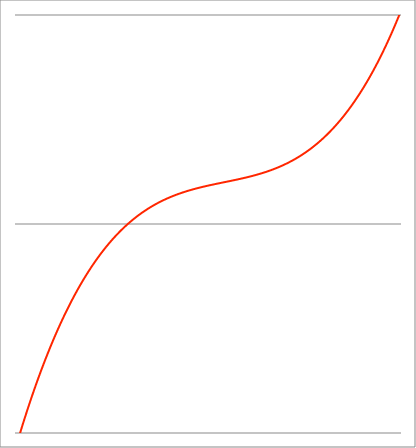
| Category | Series 1 |
|---|---|
| -1.02 | -1.065 |
| -1.019055 | -1.062 |
| -1.01811 | -1.059 |
| -1.017165 | -1.056 |
| -1.01622 | -1.053 |
| -1.015275 | -1.05 |
| -1.01433 | -1.046 |
| -1.013385 | -1.043 |
| -1.01244 | -1.04 |
| -1.011495 | -1.037 |
| -1.01055 | -1.034 |
| -1.009605 | -1.031 |
| -1.00866 | -1.028 |
| -1.007715 | -1.025 |
| -1.00677 | -1.022 |
| -1.005825 | -1.019 |
| -1.00488 | -1.016 |
| -1.003935 | -1.013 |
| -1.00299 | -1.01 |
| -1.002045000000001 | -1.007 |
| -1.001100000000001 | -1.004 |
| -1.000155000000001 | -1 |
| -0.999210000000001 | -0.997 |
| -0.998265000000001 | -0.994 |
| -0.997320000000001 | -0.991 |
| -0.996375000000001 | -0.988 |
| -0.995430000000001 | -0.985 |
| -0.994485000000001 | -0.982 |
| -0.993540000000001 | -0.979 |
| -0.992595000000001 | -0.976 |
| -0.991650000000001 | -0.973 |
| -0.990705000000001 | -0.971 |
| -0.989760000000001 | -0.968 |
| -0.988815000000001 | -0.965 |
| -0.987870000000001 | -0.962 |
| -0.986925000000001 | -0.959 |
| -0.985980000000001 | -0.956 |
| -0.985035000000001 | -0.953 |
| -0.984090000000001 | -0.95 |
| -0.983145000000001 | -0.947 |
| -0.982200000000001 | -0.944 |
| -0.981255000000001 | -0.941 |
| -0.980310000000001 | -0.938 |
| -0.979365000000001 | -0.935 |
| -0.978420000000001 | -0.932 |
| -0.977475000000001 | -0.929 |
| -0.976530000000001 | -0.927 |
| -0.975585000000001 | -0.924 |
| -0.974640000000001 | -0.921 |
| -0.973695000000001 | -0.918 |
| -0.972750000000001 | -0.915 |
| -0.971805000000001 | -0.912 |
| -0.970860000000001 | -0.909 |
| -0.969915000000001 | -0.906 |
| -0.968970000000001 | -0.904 |
| -0.968025000000001 | -0.901 |
| -0.967080000000001 | -0.898 |
| -0.966135000000001 | -0.895 |
| -0.965190000000002 | -0.892 |
| -0.964245000000002 | -0.889 |
| -0.963300000000002 | -0.887 |
| -0.962355000000002 | -0.884 |
| -0.961410000000002 | -0.881 |
| -0.960465000000002 | -0.878 |
| -0.959520000000002 | -0.875 |
| -0.958575000000002 | -0.873 |
| -0.957630000000002 | -0.87 |
| -0.956685000000002 | -0.867 |
| -0.955740000000002 | -0.864 |
| -0.954795000000002 | -0.861 |
| -0.953850000000002 | -0.859 |
| -0.952905000000002 | -0.856 |
| -0.951960000000002 | -0.853 |
| -0.951015000000002 | -0.85 |
| -0.950070000000002 | -0.848 |
| -0.949125000000002 | -0.845 |
| -0.948180000000002 | -0.842 |
| -0.947235000000002 | -0.839 |
| -0.946290000000002 | -0.837 |
| -0.945345000000002 | -0.834 |
| -0.944400000000002 | -0.831 |
| -0.943455000000002 | -0.828 |
| -0.942510000000002 | -0.826 |
| -0.941565000000002 | -0.823 |
| -0.940620000000002 | -0.82 |
| -0.939675000000002 | -0.818 |
| -0.938730000000002 | -0.815 |
| -0.937785000000002 | -0.812 |
| -0.936840000000002 | -0.81 |
| -0.935895000000002 | -0.807 |
| -0.934950000000002 | -0.804 |
| -0.934005000000002 | -0.802 |
| -0.933060000000002 | -0.799 |
| -0.932115000000002 | -0.796 |
| -0.931170000000002 | -0.794 |
| -0.930225000000002 | -0.791 |
| -0.929280000000003 | -0.788 |
| -0.928335000000003 | -0.786 |
| -0.927390000000003 | -0.783 |
| -0.926445000000003 | -0.78 |
| -0.925500000000003 | -0.778 |
| -0.924555000000003 | -0.775 |
| -0.923610000000003 | -0.773 |
| -0.922665000000003 | -0.77 |
| -0.921720000000003 | -0.767 |
| -0.920775000000003 | -0.765 |
| -0.919830000000003 | -0.762 |
| -0.918885000000003 | -0.76 |
| -0.917940000000003 | -0.757 |
| -0.916995000000003 | -0.754 |
| -0.916050000000003 | -0.752 |
| -0.915105000000003 | -0.749 |
| -0.914160000000003 | -0.747 |
| -0.913215000000003 | -0.744 |
| -0.912270000000003 | -0.742 |
| -0.911325000000003 | -0.739 |
| -0.910380000000003 | -0.737 |
| -0.909435000000003 | -0.734 |
| -0.908490000000003 | -0.732 |
| -0.907545000000003 | -0.729 |
| -0.906600000000003 | -0.726 |
| -0.905655000000003 | -0.724 |
| -0.904710000000003 | -0.721 |
| -0.903765000000003 | -0.719 |
| -0.902820000000003 | -0.716 |
| -0.901875000000003 | -0.714 |
| -0.900930000000003 | -0.711 |
| -0.899985000000003 | -0.709 |
| -0.899040000000003 | -0.706 |
| -0.898095000000003 | -0.704 |
| -0.897150000000003 | -0.702 |
| -0.896205000000003 | -0.699 |
| -0.895260000000003 | -0.697 |
| -0.894315000000003 | -0.694 |
| -0.893370000000003 | -0.692 |
| -0.892425000000004 | -0.689 |
| -0.891480000000004 | -0.687 |
| -0.890535000000004 | -0.684 |
| -0.889590000000004 | -0.682 |
| -0.888645000000004 | -0.679 |
| -0.887700000000004 | -0.677 |
| -0.886755000000004 | -0.675 |
| -0.885810000000004 | -0.672 |
| -0.884865000000004 | -0.67 |
| -0.883920000000004 | -0.667 |
| -0.882975000000004 | -0.665 |
| -0.882030000000004 | -0.663 |
| -0.881085000000004 | -0.66 |
| -0.880140000000004 | -0.658 |
| -0.879195000000004 | -0.655 |
| -0.878250000000004 | -0.653 |
| -0.877305000000004 | -0.651 |
| -0.876360000000004 | -0.648 |
| -0.875415000000004 | -0.646 |
| -0.874470000000004 | -0.644 |
| -0.873525000000004 | -0.641 |
| -0.872580000000004 | -0.639 |
| -0.871635000000004 | -0.637 |
| -0.870690000000004 | -0.634 |
| -0.869745000000004 | -0.632 |
| -0.868800000000004 | -0.63 |
| -0.867855000000004 | -0.627 |
| -0.866910000000004 | -0.625 |
| -0.865965000000004 | -0.623 |
| -0.865020000000004 | -0.62 |
| -0.864075000000004 | -0.618 |
| -0.863130000000004 | -0.616 |
| -0.862185000000004 | -0.613 |
| -0.861240000000004 | -0.611 |
| -0.860295000000004 | -0.609 |
| -0.859350000000004 | -0.606 |
| -0.858405000000004 | -0.604 |
| -0.857460000000004 | -0.602 |
| -0.856515000000005 | -0.6 |
| -0.855570000000005 | -0.597 |
| -0.854625000000005 | -0.595 |
| -0.853680000000005 | -0.593 |
| -0.852735000000005 | -0.591 |
| -0.851790000000005 | -0.588 |
| -0.850845000000005 | -0.586 |
| -0.849900000000005 | -0.584 |
| -0.848955000000005 | -0.582 |
| -0.848010000000005 | -0.579 |
| -0.847065000000005 | -0.577 |
| -0.846120000000005 | -0.575 |
| -0.845175000000005 | -0.573 |
| -0.844230000000005 | -0.571 |
| -0.843285000000005 | -0.568 |
| -0.842340000000005 | -0.566 |
| -0.841395000000005 | -0.564 |
| -0.840450000000005 | -0.562 |
| -0.839505000000005 | -0.56 |
| -0.838560000000005 | -0.557 |
| -0.837615000000005 | -0.555 |
| -0.836670000000005 | -0.553 |
| -0.835725000000005 | -0.551 |
| -0.834780000000005 | -0.549 |
| -0.833835000000005 | -0.547 |
| -0.832890000000005 | -0.544 |
| -0.831945000000005 | -0.542 |
| -0.831000000000005 | -0.54 |
| -0.830055000000005 | -0.538 |
| -0.829110000000005 | -0.536 |
| -0.828165000000005 | -0.534 |
| -0.827220000000005 | -0.532 |
| -0.826275000000005 | -0.529 |
| -0.825330000000005 | -0.527 |
| -0.824385000000005 | -0.525 |
| -0.823440000000005 | -0.523 |
| -0.822495000000005 | -0.521 |
| -0.821550000000006 | -0.519 |
| -0.820605000000006 | -0.517 |
| -0.819660000000006 | -0.515 |
| -0.818715000000006 | -0.513 |
| -0.817770000000006 | -0.51 |
| -0.816825000000006 | -0.508 |
| -0.815880000000006 | -0.506 |
| -0.814935000000006 | -0.504 |
| -0.813990000000006 | -0.502 |
| -0.813045000000006 | -0.5 |
| -0.812100000000006 | -0.498 |
| -0.811155000000006 | -0.496 |
| -0.810210000000006 | -0.494 |
| -0.809265000000006 | -0.492 |
| -0.808320000000006 | -0.49 |
| -0.807375000000006 | -0.488 |
| -0.806430000000006 | -0.486 |
| -0.805485000000006 | -0.484 |
| -0.804540000000006 | -0.482 |
| -0.803595000000006 | -0.48 |
| -0.802650000000006 | -0.478 |
| -0.801705000000006 | -0.476 |
| -0.800760000000006 | -0.474 |
| -0.799815000000006 | -0.472 |
| -0.798870000000006 | -0.47 |
| -0.797925000000006 | -0.468 |
| -0.796980000000006 | -0.466 |
| -0.796035000000006 | -0.464 |
| -0.795090000000006 | -0.462 |
| -0.794145000000006 | -0.46 |
| -0.793200000000006 | -0.458 |
| -0.792255000000006 | -0.456 |
| -0.791310000000006 | -0.454 |
| -0.790365000000006 | -0.452 |
| -0.789420000000006 | -0.45 |
| -0.788475000000006 | -0.448 |
| -0.787530000000006 | -0.446 |
| -0.786585000000006 | -0.444 |
| -0.785640000000006 | -0.442 |
| -0.784695000000006 | -0.44 |
| -0.783750000000007 | -0.438 |
| -0.782805000000007 | -0.436 |
| -0.781860000000007 | -0.434 |
| -0.780915000000007 | -0.432 |
| -0.779970000000007 | -0.43 |
| -0.779025000000007 | -0.429 |
| -0.778080000000007 | -0.427 |
| -0.777135000000007 | -0.425 |
| -0.776190000000007 | -0.423 |
| -0.775245000000007 | -0.421 |
| -0.774300000000007 | -0.419 |
| -0.773355000000007 | -0.417 |
| -0.772410000000007 | -0.415 |
| -0.771465000000007 | -0.413 |
| -0.770520000000007 | -0.412 |
| -0.769575000000007 | -0.41 |
| -0.768630000000007 | -0.408 |
| -0.767685000000007 | -0.406 |
| -0.766740000000007 | -0.404 |
| -0.765795000000007 | -0.402 |
| -0.764850000000007 | -0.4 |
| -0.763905000000007 | -0.399 |
| -0.762960000000007 | -0.397 |
| -0.762015000000007 | -0.395 |
| -0.761070000000007 | -0.393 |
| -0.760125000000007 | -0.391 |
| -0.759180000000007 | -0.389 |
| -0.758235000000007 | -0.388 |
| -0.757290000000007 | -0.386 |
| -0.756345000000007 | -0.384 |
| -0.755400000000007 | -0.382 |
| -0.754455000000007 | -0.38 |
| -0.753510000000007 | -0.379 |
| -0.752565000000007 | -0.377 |
| -0.751620000000007 | -0.375 |
| -0.750675000000007 | -0.373 |
| -0.749730000000007 | -0.371 |
| -0.748785000000008 | -0.37 |
| -0.747840000000008 | -0.368 |
| -0.746895000000008 | -0.366 |
| -0.745950000000008 | -0.364 |
| -0.745005000000008 | -0.363 |
| -0.744060000000008 | -0.361 |
| -0.743115000000008 | -0.359 |
| -0.742170000000008 | -0.357 |
| -0.741225000000008 | -0.355 |
| -0.740280000000008 | -0.354 |
| -0.739335000000008 | -0.352 |
| -0.738390000000008 | -0.35 |
| -0.737445000000008 | -0.349 |
| -0.736500000000008 | -0.347 |
| -0.735555000000008 | -0.345 |
| -0.734610000000008 | -0.343 |
| -0.733665000000008 | -0.342 |
| -0.732720000000008 | -0.34 |
| -0.731775000000008 | -0.338 |
| -0.730830000000008 | -0.337 |
| -0.729885000000008 | -0.335 |
| -0.728940000000008 | -0.333 |
| -0.727995000000008 | -0.331 |
| -0.727050000000008 | -0.33 |
| -0.726105000000008 | -0.328 |
| -0.725160000000008 | -0.326 |
| -0.724215000000008 | -0.325 |
| -0.723270000000008 | -0.323 |
| -0.722325000000008 | -0.321 |
| -0.721380000000008 | -0.32 |
| -0.720435000000008 | -0.318 |
| -0.719490000000008 | -0.316 |
| -0.718545000000008 | -0.315 |
| -0.717600000000008 | -0.313 |
| -0.716655000000008 | -0.311 |
| -0.715710000000008 | -0.31 |
| -0.714765000000008 | -0.308 |
| -0.713820000000008 | -0.306 |
| -0.712875000000009 | -0.305 |
| -0.711930000000009 | -0.303 |
| -0.710985000000009 | -0.302 |
| -0.710040000000009 | -0.3 |
| -0.709095000000009 | -0.298 |
| -0.708150000000009 | -0.297 |
| -0.707205000000009 | -0.295 |
| -0.706260000000009 | -0.294 |
| -0.705315000000009 | -0.292 |
| -0.704370000000009 | -0.29 |
| -0.703425000000009 | -0.289 |
| -0.702480000000009 | -0.287 |
| -0.701535000000009 | -0.286 |
| -0.700590000000009 | -0.284 |
| -0.699645000000009 | -0.282 |
| -0.698700000000009 | -0.281 |
| -0.697755000000009 | -0.279 |
| -0.696810000000009 | -0.278 |
| -0.695865000000009 | -0.276 |
| -0.694920000000009 | -0.275 |
| -0.693975000000009 | -0.273 |
| -0.693030000000009 | -0.271 |
| -0.692085000000009 | -0.27 |
| -0.691140000000009 | -0.268 |
| -0.690195000000009 | -0.267 |
| -0.689250000000009 | -0.265 |
| -0.688305000000009 | -0.264 |
| -0.687360000000009 | -0.262 |
| -0.686415000000009 | -0.261 |
| -0.685470000000009 | -0.259 |
| -0.684525000000009 | -0.258 |
| -0.683580000000009 | -0.256 |
| -0.682635000000009 | -0.255 |
| -0.681690000000009 | -0.253 |
| -0.680745000000009 | -0.252 |
| -0.679800000000009 | -0.25 |
| -0.678855000000009 | -0.249 |
| -0.677910000000009 | -0.247 |
| -0.676965000000009 | -0.246 |
| -0.67602000000001 | -0.244 |
| -0.67507500000001 | -0.243 |
| -0.67413000000001 | -0.241 |
| -0.67318500000001 | -0.24 |
| -0.67224000000001 | -0.238 |
| -0.67129500000001 | -0.237 |
| -0.67035000000001 | -0.235 |
| -0.66940500000001 | -0.234 |
| -0.66846000000001 | -0.232 |
| -0.66751500000001 | -0.231 |
| -0.66657000000001 | -0.229 |
| -0.66562500000001 | -0.228 |
| -0.66468000000001 | -0.227 |
| -0.66373500000001 | -0.225 |
| -0.66279000000001 | -0.224 |
| -0.66184500000001 | -0.222 |
| -0.66090000000001 | -0.221 |
| -0.65995500000001 | -0.219 |
| -0.65901000000001 | -0.218 |
| -0.65806500000001 | -0.217 |
| -0.65712000000001 | -0.215 |
| -0.65617500000001 | -0.214 |
| -0.65523000000001 | -0.212 |
| -0.65428500000001 | -0.211 |
| -0.65334000000001 | -0.21 |
| -0.65239500000001 | -0.208 |
| -0.65145000000001 | -0.207 |
| -0.65050500000001 | -0.205 |
| -0.64956000000001 | -0.204 |
| -0.64861500000001 | -0.203 |
| -0.64767000000001 | -0.201 |
| -0.64672500000001 | -0.2 |
| -0.64578000000001 | -0.198 |
| -0.64483500000001 | -0.197 |
| -0.64389000000001 | -0.196 |
| -0.64294500000001 | -0.194 |
| -0.64200000000001 | -0.193 |
| -0.64105500000001 | -0.192 |
| -0.640110000000011 | -0.19 |
| -0.639165000000011 | -0.189 |
| -0.638220000000011 | -0.188 |
| -0.637275000000011 | -0.186 |
| -0.636330000000011 | -0.185 |
| -0.635385000000011 | -0.184 |
| -0.634440000000011 | -0.182 |
| -0.633495000000011 | -0.181 |
| -0.632550000000011 | -0.18 |
| -0.631605000000011 | -0.178 |
| -0.630660000000011 | -0.177 |
| -0.629715000000011 | -0.176 |
| -0.628770000000011 | -0.174 |
| -0.627825000000011 | -0.173 |
| -0.626880000000011 | -0.172 |
| -0.625935000000011 | -0.17 |
| -0.624990000000011 | -0.169 |
| -0.624045000000011 | -0.168 |
| -0.623100000000011 | -0.167 |
| -0.622155000000011 | -0.165 |
| -0.621210000000011 | -0.164 |
| -0.620265000000011 | -0.163 |
| -0.619320000000011 | -0.161 |
| -0.618375000000011 | -0.16 |
| -0.617430000000011 | -0.159 |
| -0.616485000000011 | -0.158 |
| -0.615540000000011 | -0.156 |
| -0.614595000000011 | -0.155 |
| -0.613650000000011 | -0.154 |
| -0.612705000000011 | -0.153 |
| -0.611760000000011 | -0.151 |
| -0.610815000000011 | -0.15 |
| -0.609870000000011 | -0.149 |
| -0.608925000000011 | -0.148 |
| -0.607980000000011 | -0.146 |
| -0.607035000000011 | -0.145 |
| -0.606090000000011 | -0.144 |
| -0.605145000000012 | -0.143 |
| -0.604200000000012 | -0.141 |
| -0.603255000000012 | -0.14 |
| -0.602310000000012 | -0.139 |
| -0.601365000000012 | -0.138 |
| -0.600420000000012 | -0.137 |
| -0.599475000000012 | -0.135 |
| -0.598530000000012 | -0.134 |
| -0.597585000000012 | -0.133 |
| -0.596640000000012 | -0.132 |
| -0.595695000000012 | -0.131 |
| -0.594750000000012 | -0.129 |
| -0.593805000000012 | -0.128 |
| -0.592860000000012 | -0.127 |
| -0.591915000000012 | -0.126 |
| -0.590970000000012 | -0.125 |
| -0.590025000000012 | -0.123 |
| -0.589080000000012 | -0.122 |
| -0.588135000000012 | -0.121 |
| -0.587190000000012 | -0.12 |
| -0.586245000000012 | -0.119 |
| -0.585300000000012 | -0.118 |
| -0.584355000000012 | -0.116 |
| -0.583410000000012 | -0.115 |
| -0.582465000000012 | -0.114 |
| -0.581520000000012 | -0.113 |
| -0.580575000000012 | -0.112 |
| -0.579630000000012 | -0.111 |
| -0.578685000000012 | -0.11 |
| -0.577740000000012 | -0.108 |
| -0.576795000000012 | -0.107 |
| -0.575850000000012 | -0.106 |
| -0.574905000000012 | -0.105 |
| -0.573960000000012 | -0.104 |
| -0.573015000000012 | -0.103 |
| -0.572070000000013 | -0.102 |
| -0.571125000000013 | -0.101 |
| -0.570180000000013 | -0.099 |
| -0.569235000000013 | -0.098 |
| -0.568290000000013 | -0.097 |
| -0.567345000000013 | -0.096 |
| -0.566400000000013 | -0.095 |
| -0.565455000000013 | -0.094 |
| -0.564510000000013 | -0.093 |
| -0.563565000000013 | -0.092 |
| -0.562620000000013 | -0.091 |
| -0.561675000000013 | -0.09 |
| -0.560730000000013 | -0.088 |
| -0.559785000000013 | -0.087 |
| -0.558840000000013 | -0.086 |
| -0.557895000000013 | -0.085 |
| -0.556950000000013 | -0.084 |
| -0.556005000000013 | -0.083 |
| -0.555060000000013 | -0.082 |
| -0.554115000000013 | -0.081 |
| -0.553170000000013 | -0.08 |
| -0.552225000000013 | -0.079 |
| -0.551280000000013 | -0.078 |
| -0.550335000000013 | -0.077 |
| -0.549390000000013 | -0.076 |
| -0.548445000000013 | -0.075 |
| -0.547500000000013 | -0.074 |
| -0.546555000000013 | -0.073 |
| -0.545610000000013 | -0.072 |
| -0.544665000000013 | -0.071 |
| -0.543720000000013 | -0.069 |
| -0.542775000000013 | -0.068 |
| -0.541830000000013 | -0.067 |
| -0.540885000000013 | -0.066 |
| -0.539940000000013 | -0.065 |
| -0.538995000000013 | -0.064 |
| -0.538050000000013 | -0.063 |
| -0.537105000000013 | -0.062 |
| -0.536160000000014 | -0.061 |
| -0.535215000000014 | -0.06 |
| -0.534270000000014 | -0.059 |
| -0.533325000000014 | -0.058 |
| -0.532380000000014 | -0.057 |
| -0.531435000000014 | -0.056 |
| -0.530490000000014 | -0.055 |
| -0.529545000000014 | -0.054 |
| -0.528600000000014 | -0.053 |
| -0.527655000000014 | -0.052 |
| -0.526710000000014 | -0.051 |
| -0.525765000000014 | -0.05 |
| -0.524820000000014 | -0.05 |
| -0.523875000000014 | -0.049 |
| -0.522930000000014 | -0.048 |
| -0.521985000000014 | -0.047 |
| -0.521040000000014 | -0.046 |
| -0.520095000000014 | -0.045 |
| -0.519150000000014 | -0.044 |
| -0.518205000000014 | -0.043 |
| -0.517260000000014 | -0.042 |
| -0.516315000000014 | -0.041 |
| -0.515370000000014 | -0.04 |
| -0.514425000000014 | -0.039 |
| -0.513480000000014 | -0.038 |
| -0.512535000000014 | -0.037 |
| -0.511590000000014 | -0.036 |
| -0.510645000000014 | -0.035 |
| -0.509700000000014 | -0.034 |
| -0.508755000000014 | -0.033 |
| -0.507810000000014 | -0.033 |
| -0.506865000000014 | -0.032 |
| -0.505920000000014 | -0.031 |
| -0.504975000000014 | -0.03 |
| -0.504030000000014 | -0.029 |
| -0.503085000000014 | -0.028 |
| -0.502140000000014 | -0.027 |
| -0.501195000000014 | -0.026 |
| -0.500250000000015 | -0.025 |
| -0.499305000000014 | -0.024 |
| -0.498360000000015 | -0.023 |
| -0.497415000000015 | -0.023 |
| -0.496470000000015 | -0.022 |
| -0.495525000000015 | -0.021 |
| -0.494580000000015 | -0.02 |
| -0.493635000000015 | -0.019 |
| -0.492690000000015 | -0.018 |
| -0.491745000000015 | -0.017 |
| -0.490800000000015 | -0.016 |
| -0.489855000000015 | -0.016 |
| -0.488910000000015 | -0.015 |
| -0.487965000000015 | -0.014 |
| -0.487020000000015 | -0.013 |
| -0.486075000000015 | -0.012 |
| -0.485130000000015 | -0.011 |
| -0.484185000000015 | -0.01 |
| -0.483240000000015 | -0.009 |
| -0.482295000000015 | -0.009 |
| -0.481350000000015 | -0.008 |
| -0.480405000000015 | -0.007 |
| -0.479460000000015 | -0.006 |
| -0.478515000000015 | -0.005 |
| -0.477570000000015 | -0.004 |
| -0.476625000000015 | -0.004 |
| -0.475680000000015 | -0.003 |
| -0.474735000000015 | -0.002 |
| -0.473790000000015 | -0.001 |
| -0.472845000000015 | 0 |
| -0.471900000000015 | 0.001 |
| -0.470955000000015 | 0.001 |
| -0.470010000000015 | 0.002 |
| -0.469065000000015 | 0.003 |
| -0.468120000000015 | 0.004 |
| -0.467175000000015 | 0.005 |
| -0.466230000000015 | 0.005 |
| -0.465285000000015 | 0.006 |
| -0.464340000000015 | 0.007 |
| -0.463395000000016 | 0.008 |
| -0.462450000000016 | 0.009 |
| -0.461505000000016 | 0.009 |
| -0.460560000000016 | 0.01 |
| -0.459615000000016 | 0.011 |
| -0.458670000000016 | 0.012 |
| -0.457725000000016 | 0.013 |
| -0.456780000000016 | 0.013 |
| -0.455835000000016 | 0.014 |
| -0.454890000000016 | 0.015 |
| -0.453945000000016 | 0.016 |
| -0.453000000000016 | 0.016 |
| -0.452055000000016 | 0.017 |
| -0.451110000000016 | 0.018 |
| -0.450165000000016 | 0.019 |
| -0.449220000000016 | 0.02 |
| -0.448275000000016 | 0.02 |
| -0.447330000000016 | 0.021 |
| -0.446385000000016 | 0.022 |
| -0.445440000000016 | 0.023 |
| -0.444495000000016 | 0.023 |
| -0.443550000000016 | 0.024 |
| -0.442605000000016 | 0.025 |
| -0.441660000000016 | 0.026 |
| -0.440715000000016 | 0.026 |
| -0.439770000000016 | 0.027 |
| -0.438825000000016 | 0.028 |
| -0.437880000000016 | 0.028 |
| -0.436935000000016 | 0.029 |
| -0.435990000000016 | 0.03 |
| -0.435045000000016 | 0.031 |
| -0.434100000000016 | 0.031 |
| -0.433155000000016 | 0.032 |
| -0.432210000000016 | 0.033 |
| -0.431265000000016 | 0.034 |
| -0.430320000000016 | 0.034 |
| -0.429375000000016 | 0.035 |
| -0.428430000000016 | 0.036 |
| -0.427485000000017 | 0.036 |
| -0.426540000000017 | 0.037 |
| -0.425595000000017 | 0.038 |
| -0.424650000000017 | 0.038 |
| -0.423705000000017 | 0.039 |
| -0.422760000000017 | 0.04 |
| -0.421815000000017 | 0.041 |
| -0.420870000000017 | 0.041 |
| -0.419925000000017 | 0.042 |
| -0.418980000000017 | 0.043 |
| -0.418035000000017 | 0.043 |
| -0.417090000000017 | 0.044 |
| -0.416145000000017 | 0.045 |
| -0.415200000000017 | 0.045 |
| -0.414255000000017 | 0.046 |
| -0.413310000000017 | 0.047 |
| -0.412365000000017 | 0.047 |
| -0.411420000000017 | 0.048 |
| -0.410475000000017 | 0.049 |
| -0.409530000000017 | 0.049 |
| -0.408585000000017 | 0.05 |
| -0.407640000000017 | 0.051 |
| -0.406695000000017 | 0.051 |
| -0.405750000000017 | 0.052 |
| -0.404805000000017 | 0.053 |
| -0.403860000000017 | 0.053 |
| -0.402915000000017 | 0.054 |
| -0.401970000000017 | 0.055 |
| -0.401025000000017 | 0.055 |
| -0.400080000000017 | 0.056 |
| -0.399135000000017 | 0.057 |
| -0.398190000000017 | 0.057 |
| -0.397245000000017 | 0.058 |
| -0.396300000000017 | 0.058 |
| -0.395355000000017 | 0.059 |
| -0.394410000000017 | 0.06 |
| -0.393465000000017 | 0.06 |
| -0.392520000000017 | 0.061 |
| -0.391575000000017 | 0.062 |
| -0.390630000000018 | 0.062 |
| -0.389685000000018 | 0.063 |
| -0.388740000000018 | 0.064 |
| -0.387795000000018 | 0.064 |
| -0.386850000000018 | 0.065 |
| -0.385905000000018 | 0.065 |
| -0.384960000000018 | 0.066 |
| -0.384015000000018 | 0.067 |
| -0.383070000000018 | 0.067 |
| -0.382125000000018 | 0.068 |
| -0.381180000000018 | 0.068 |
| -0.380235000000018 | 0.069 |
| -0.379290000000018 | 0.07 |
| -0.378345000000018 | 0.07 |
| -0.377400000000018 | 0.071 |
| -0.376455000000018 | 0.071 |
| -0.375510000000018 | 0.072 |
| -0.374565000000018 | 0.073 |
| -0.373620000000018 | 0.073 |
| -0.372675000000018 | 0.074 |
| -0.371730000000018 | 0.074 |
| -0.370785000000018 | 0.075 |
| -0.369840000000018 | 0.075 |
| -0.368895000000018 | 0.076 |
| -0.367950000000018 | 0.077 |
| -0.367005000000018 | 0.077 |
| -0.366060000000018 | 0.078 |
| -0.365115000000018 | 0.078 |
| -0.364170000000018 | 0.079 |
| -0.363225000000018 | 0.079 |
| -0.362280000000018 | 0.08 |
| -0.361335000000018 | 0.081 |
| -0.360390000000018 | 0.081 |
| -0.359445000000018 | 0.082 |
| -0.358500000000018 | 0.082 |
| -0.357555000000018 | 0.083 |
| -0.356610000000018 | 0.083 |
| -0.355665000000018 | 0.084 |
| -0.354720000000019 | 0.084 |
| -0.353775000000019 | 0.085 |
| -0.352830000000019 | 0.086 |
| -0.351885000000019 | 0.086 |
| -0.350940000000019 | 0.087 |
| -0.349995000000019 | 0.087 |
| -0.349050000000019 | 0.088 |
| -0.348105000000019 | 0.088 |
| -0.347160000000019 | 0.089 |
| -0.346215000000019 | 0.089 |
| -0.345270000000019 | 0.09 |
| -0.344325000000019 | 0.09 |
| -0.343380000000019 | 0.091 |
| -0.342435000000019 | 0.091 |
| -0.341490000000019 | 0.092 |
| -0.340545000000019 | 0.092 |
| -0.339600000000019 | 0.093 |
| -0.338655000000019 | 0.093 |
| -0.337710000000019 | 0.094 |
| -0.336765000000019 | 0.094 |
| -0.335820000000019 | 0.095 |
| -0.334875000000019 | 0.095 |
| -0.333930000000019 | 0.096 |
| -0.332985000000019 | 0.096 |
| -0.332040000000019 | 0.097 |
| -0.331095000000019 | 0.097 |
| -0.330150000000019 | 0.098 |
| -0.329205000000019 | 0.098 |
| -0.328260000000019 | 0.099 |
| -0.327315000000019 | 0.099 |
| -0.326370000000019 | 0.1 |
| -0.325425000000019 | 0.1 |
| -0.324480000000019 | 0.101 |
| -0.323535000000019 | 0.101 |
| -0.322590000000019 | 0.102 |
| -0.321645000000019 | 0.102 |
| -0.320700000000019 | 0.103 |
| -0.31975500000002 | 0.103 |
| -0.31881000000002 | 0.104 |
| -0.31786500000002 | 0.104 |
| -0.31692000000002 | 0.105 |
| -0.31597500000002 | 0.105 |
| -0.31503000000002 | 0.106 |
| -0.31408500000002 | 0.106 |
| -0.31314000000002 | 0.107 |
| -0.31219500000002 | 0.107 |
| -0.31125000000002 | 0.108 |
| -0.31030500000002 | 0.108 |
| -0.30936000000002 | 0.109 |
| -0.30841500000002 | 0.109 |
| -0.30747000000002 | 0.109 |
| -0.30652500000002 | 0.11 |
| -0.30558000000002 | 0.11 |
| -0.30463500000002 | 0.111 |
| -0.30369000000002 | 0.111 |
| -0.30274500000002 | 0.112 |
| -0.30180000000002 | 0.112 |
| -0.30085500000002 | 0.113 |
| -0.29991000000002 | 0.113 |
| -0.29896500000002 | 0.113 |
| -0.29802000000002 | 0.114 |
| -0.29707500000002 | 0.114 |
| -0.29613000000002 | 0.115 |
| -0.29518500000002 | 0.115 |
| -0.29424000000002 | 0.116 |
| -0.29329500000002 | 0.116 |
| -0.29235000000002 | 0.117 |
| -0.29140500000002 | 0.117 |
| -0.29046000000002 | 0.117 |
| -0.28951500000002 | 0.118 |
| -0.28857000000002 | 0.118 |
| -0.28762500000002 | 0.119 |
| -0.28668000000002 | 0.119 |
| -0.28573500000002 | 0.12 |
| -0.28479000000002 | 0.12 |
| -0.283845000000021 | 0.12 |
| -0.282900000000021 | 0.121 |
| -0.281955000000021 | 0.121 |
| -0.281010000000021 | 0.122 |
| -0.280065000000021 | 0.122 |
| -0.279120000000021 | 0.122 |
| -0.278175000000021 | 0.123 |
| -0.277230000000021 | 0.123 |
| -0.276285000000021 | 0.124 |
| -0.275340000000021 | 0.124 |
| -0.274395000000021 | 0.124 |
| -0.273450000000021 | 0.125 |
| -0.272505000000021 | 0.125 |
| -0.271560000000021 | 0.126 |
| -0.270615000000021 | 0.126 |
| -0.269670000000021 | 0.126 |
| -0.268725000000021 | 0.127 |
| -0.267780000000021 | 0.127 |
| -0.266835000000021 | 0.128 |
| -0.265890000000021 | 0.128 |
| -0.264945000000021 | 0.128 |
| -0.264000000000021 | 0.129 |
| -0.263055000000021 | 0.129 |
| -0.262110000000021 | 0.13 |
| -0.261165000000021 | 0.13 |
| -0.260220000000021 | 0.13 |
| -0.259275000000021 | 0.131 |
| -0.258330000000021 | 0.131 |
| -0.257385000000021 | 0.131 |
| -0.256440000000021 | 0.132 |
| -0.255495000000021 | 0.132 |
| -0.254550000000021 | 0.133 |
| -0.253605000000021 | 0.133 |
| -0.252660000000021 | 0.133 |
| -0.251715000000021 | 0.134 |
| -0.250770000000021 | 0.134 |
| -0.249825000000021 | 0.134 |
| -0.248880000000021 | 0.135 |
| -0.247935000000021 | 0.135 |
| -0.246990000000021 | 0.136 |
| -0.246045000000021 | 0.136 |
| -0.245100000000021 | 0.136 |
| -0.244155000000021 | 0.137 |
| -0.243210000000021 | 0.137 |
| -0.242265000000021 | 0.137 |
| -0.241320000000021 | 0.138 |
| -0.240375000000021 | 0.138 |
| -0.239430000000021 | 0.138 |
| -0.238485000000021 | 0.139 |
| -0.237540000000021 | 0.139 |
| -0.236595000000021 | 0.139 |
| -0.235650000000021 | 0.14 |
| -0.234705000000021 | 0.14 |
| -0.233760000000021 | 0.14 |
| -0.232815000000021 | 0.141 |
| -0.231870000000021 | 0.141 |
| -0.230925000000021 | 0.142 |
| -0.229980000000021 | 0.142 |
| -0.229035000000021 | 0.142 |
| -0.228090000000021 | 0.143 |
| -0.227145000000021 | 0.143 |
| -0.226200000000021 | 0.143 |
| -0.225255000000021 | 0.144 |
| -0.224310000000021 | 0.144 |
| -0.223365000000021 | 0.144 |
| -0.222420000000021 | 0.145 |
| -0.221475000000021 | 0.145 |
| -0.220530000000021 | 0.145 |
| -0.219585000000021 | 0.145 |
| -0.218640000000021 | 0.146 |
| -0.217695000000021 | 0.146 |
| -0.216750000000021 | 0.146 |
| -0.215805000000021 | 0.147 |
| -0.214860000000021 | 0.147 |
| -0.213915000000021 | 0.147 |
| -0.212970000000021 | 0.148 |
| -0.212025000000021 | 0.148 |
| -0.211080000000021 | 0.148 |
| -0.210135000000021 | 0.149 |
| -0.209190000000021 | 0.149 |
| -0.208245000000021 | 0.149 |
| -0.207300000000021 | 0.15 |
| -0.206355000000021 | 0.15 |
| -0.205410000000021 | 0.15 |
| -0.204465000000021 | 0.151 |
| -0.203520000000021 | 0.151 |
| -0.202575000000021 | 0.151 |
| -0.201630000000021 | 0.151 |
| -0.200685000000021 | 0.152 |
| -0.199740000000021 | 0.152 |
| -0.198795000000021 | 0.152 |
| -0.197850000000021 | 0.153 |
| -0.196905000000021 | 0.153 |
| -0.195960000000021 | 0.153 |
| -0.195015000000021 | 0.154 |
| -0.194070000000021 | 0.154 |
| -0.193125000000021 | 0.154 |
| -0.192180000000021 | 0.154 |
| -0.191235000000021 | 0.155 |
| -0.190290000000021 | 0.155 |
| -0.189345000000021 | 0.155 |
| -0.188400000000021 | 0.156 |
| -0.187455000000021 | 0.156 |
| -0.186510000000021 | 0.156 |
| -0.185565000000021 | 0.156 |
| -0.184620000000021 | 0.157 |
| -0.183675000000021 | 0.157 |
| -0.182730000000021 | 0.157 |
| -0.181785000000021 | 0.158 |
| -0.180840000000021 | 0.158 |
| -0.179895000000021 | 0.158 |
| -0.178950000000021 | 0.158 |
| -0.178005000000021 | 0.159 |
| -0.177060000000021 | 0.159 |
| -0.176115000000021 | 0.159 |
| -0.175170000000021 | 0.16 |
| -0.174225000000021 | 0.16 |
| -0.173280000000021 | 0.16 |
| -0.172335000000021 | 0.16 |
| -0.171390000000021 | 0.161 |
| -0.170445000000021 | 0.161 |
| -0.169500000000021 | 0.161 |
| -0.168555000000021 | 0.162 |
| -0.167610000000021 | 0.162 |
| -0.166665000000021 | 0.162 |
| -0.165720000000021 | 0.162 |
| -0.164775000000021 | 0.163 |
| -0.163830000000021 | 0.163 |
| -0.162885000000021 | 0.163 |
| -0.161940000000021 | 0.163 |
| -0.160995000000021 | 0.164 |
| -0.160050000000021 | 0.164 |
| -0.159105000000021 | 0.164 |
| -0.158160000000021 | 0.164 |
| -0.157215000000021 | 0.165 |
| -0.156270000000021 | 0.165 |
| -0.155325000000021 | 0.165 |
| -0.154380000000021 | 0.165 |
| -0.153435000000021 | 0.166 |
| -0.152490000000021 | 0.166 |
| -0.151545000000021 | 0.166 |
| -0.150600000000021 | 0.166 |
| -0.149655000000021 | 0.167 |
| -0.148710000000021 | 0.167 |
| -0.147765000000021 | 0.167 |
| -0.146820000000021 | 0.167 |
| -0.145875000000021 | 0.168 |
| -0.144930000000021 | 0.168 |
| -0.143985000000021 | 0.168 |
| -0.143040000000021 | 0.168 |
| -0.142095000000021 | 0.169 |
| -0.141150000000021 | 0.169 |
| -0.140205000000021 | 0.169 |
| -0.139260000000021 | 0.169 |
| -0.138315000000021 | 0.17 |
| -0.137370000000021 | 0.17 |
| -0.136425000000021 | 0.17 |
| -0.135480000000021 | 0.17 |
| -0.134535000000021 | 0.171 |
| -0.133590000000021 | 0.171 |
| -0.132645000000021 | 0.171 |
| -0.131700000000021 | 0.171 |
| -0.130755000000021 | 0.172 |
| -0.129810000000021 | 0.172 |
| -0.128865000000021 | 0.172 |
| -0.127920000000021 | 0.172 |
| -0.126975000000021 | 0.173 |
| -0.126030000000021 | 0.173 |
| -0.125085000000021 | 0.173 |
| -0.124140000000021 | 0.173 |
| -0.123195000000021 | 0.173 |
| -0.122250000000021 | 0.174 |
| -0.121305000000021 | 0.174 |
| -0.120360000000021 | 0.174 |
| -0.119415000000021 | 0.174 |
| -0.118470000000021 | 0.175 |
| -0.117525000000021 | 0.175 |
| -0.116580000000021 | 0.175 |
| -0.115635000000021 | 0.175 |
| -0.114690000000021 | 0.176 |
| -0.113745000000021 | 0.176 |
| -0.112800000000021 | 0.176 |
| -0.111855000000021 | 0.176 |
| -0.110910000000021 | 0.176 |
| -0.109965000000021 | 0.177 |
| -0.109020000000021 | 0.177 |
| -0.108075000000021 | 0.177 |
| -0.107130000000021 | 0.177 |
| -0.106185000000021 | 0.178 |
| -0.105240000000021 | 0.178 |
| -0.104295000000021 | 0.178 |
| -0.103350000000021 | 0.178 |
| -0.102405000000021 | 0.178 |
| -0.101460000000021 | 0.179 |
| -0.100515000000021 | 0.179 |
| -0.0995700000000212 | 0.179 |
| -0.0986250000000212 | 0.179 |
| -0.0976800000000212 | 0.18 |
| -0.0967350000000212 | 0.18 |
| -0.0957900000000212 | 0.18 |
| -0.0948450000000212 | 0.18 |
| -0.0939000000000212 | 0.18 |
| -0.0929550000000212 | 0.181 |
| -0.0920100000000212 | 0.181 |
| -0.0910650000000212 | 0.181 |
| -0.0901200000000212 | 0.181 |
| -0.0891750000000212 | 0.181 |
| -0.0882300000000212 | 0.182 |
| -0.0872850000000212 | 0.182 |
| -0.0863400000000212 | 0.182 |
| -0.0853950000000212 | 0.182 |
| -0.0844500000000212 | 0.183 |
| -0.0835050000000212 | 0.183 |
| -0.0825600000000212 | 0.183 |
| -0.0816150000000212 | 0.183 |
| -0.0806700000000212 | 0.183 |
| -0.0797250000000212 | 0.184 |
| -0.0787800000000212 | 0.184 |
| -0.0778350000000212 | 0.184 |
| -0.0768900000000212 | 0.184 |
| -0.0759450000000212 | 0.184 |
| -0.0750000000000212 | 0.185 |
| -0.0740550000000212 | 0.185 |
| -0.0731100000000212 | 0.185 |
| -0.0721650000000212 | 0.185 |
| -0.0712200000000212 | 0.185 |
| -0.0702750000000212 | 0.186 |
| -0.0693300000000212 | 0.186 |
| -0.0683850000000212 | 0.186 |
| -0.0674400000000212 | 0.186 |
| -0.0664950000000212 | 0.186 |
| -0.0655500000000212 | 0.187 |
| -0.0646050000000212 | 0.187 |
| -0.0636600000000212 | 0.187 |
| -0.0627150000000212 | 0.187 |
| -0.0617700000000212 | 0.187 |
| -0.0608250000000212 | 0.188 |
| -0.0598800000000212 | 0.188 |
| -0.0589350000000212 | 0.188 |
| -0.0579900000000212 | 0.188 |
| -0.0570450000000212 | 0.188 |
| -0.0561000000000212 | 0.189 |
| -0.0551550000000212 | 0.189 |
| -0.0542100000000212 | 0.189 |
| -0.0532650000000212 | 0.189 |
| -0.0523200000000212 | 0.189 |
| -0.0513750000000212 | 0.19 |
| -0.0504300000000212 | 0.19 |
| -0.0494850000000212 | 0.19 |
| -0.0485400000000212 | 0.19 |
| -0.0475950000000212 | 0.19 |
| -0.0466500000000212 | 0.191 |
| -0.0457050000000212 | 0.191 |
| -0.0447600000000212 | 0.191 |
| -0.0438150000000212 | 0.191 |
| -0.0428700000000212 | 0.191 |
| -0.0419250000000212 | 0.192 |
| -0.0409800000000212 | 0.192 |
| -0.0400350000000212 | 0.192 |
| -0.0390900000000212 | 0.192 |
| -0.0381450000000212 | 0.192 |
| -0.0372000000000212 | 0.193 |
| -0.0362550000000212 | 0.193 |
| -0.0353100000000212 | 0.193 |
| -0.0343650000000211 | 0.193 |
| -0.0334200000000211 | 0.193 |
| -0.0324750000000211 | 0.193 |
| -0.0315300000000211 | 0.194 |
| -0.0305850000000211 | 0.194 |
| -0.0296400000000211 | 0.194 |
| -0.0286950000000211 | 0.194 |
| -0.0277500000000211 | 0.194 |
| -0.0268050000000211 | 0.195 |
| -0.0258600000000211 | 0.195 |
| -0.0249150000000211 | 0.195 |
| -0.0239700000000211 | 0.195 |
| -0.0230250000000211 | 0.195 |
| -0.0220800000000211 | 0.196 |
| -0.0211350000000211 | 0.196 |
| -0.0201900000000211 | 0.196 |
| -0.0192450000000211 | 0.196 |
| -0.0183000000000211 | 0.196 |
| -0.0173550000000211 | 0.197 |
| -0.0164100000000211 | 0.197 |
| -0.0154650000000211 | 0.197 |
| -0.0145200000000211 | 0.197 |
| -0.0135750000000211 | 0.197 |
| -0.0126300000000211 | 0.197 |
| -0.0116850000000211 | 0.198 |
| -0.0107400000000211 | 0.198 |
| -0.00979500000002113 | 0.198 |
| -0.00885000000002113 | 0.198 |
| -0.00790500000002113 | 0.198 |
| -0.00696000000002113 | 0.199 |
| -0.00601500000002113 | 0.199 |
| -0.00507000000002113 | 0.199 |
| -0.00412500000002113 | 0.199 |
| -0.00318000000002113 | 0.199 |
| -0.00223500000002113 | 0.2 |
| -0.00129000000002113 | 0.2 |
| -0.000345000000021134 | 0.2 |
| 0.000599999999978866 | 0.2 |
| 0.00154499999997887 | 0.2 |
| 0.00248999999997887 | 0.2 |
| 0.00343499999997887 | 0.201 |
| 0.00437999999997887 | 0.201 |
| 0.00532499999997886 | 0.201 |
| 0.00626999999997886 | 0.201 |
| 0.00721499999997886 | 0.201 |
| 0.00815999999997886 | 0.202 |
| 0.00910499999997886 | 0.202 |
| 0.0100499999999789 | 0.202 |
| 0.0109949999999789 | 0.202 |
| 0.0119399999999789 | 0.202 |
| 0.0128849999999789 | 0.203 |
| 0.0138299999999789 | 0.203 |
| 0.0147749999999789 | 0.203 |
| 0.0157199999999789 | 0.203 |
| 0.0166649999999789 | 0.203 |
| 0.0176099999999789 | 0.204 |
| 0.0185549999999789 | 0.204 |
| 0.0194999999999789 | 0.204 |
| 0.0204449999999789 | 0.204 |
| 0.0213899999999789 | 0.204 |
| 0.0223349999999789 | 0.204 |
| 0.0232799999999789 | 0.205 |
| 0.0242249999999789 | 0.205 |
| 0.0251699999999789 | 0.205 |
| 0.0261149999999789 | 0.205 |
| 0.0270599999999789 | 0.205 |
| 0.0280049999999789 | 0.206 |
| 0.0289499999999789 | 0.206 |
| 0.0298949999999789 | 0.206 |
| 0.0308399999999789 | 0.206 |
| 0.0317849999999789 | 0.206 |
| 0.0327299999999789 | 0.207 |
| 0.0336749999999789 | 0.207 |
| 0.0346199999999789 | 0.207 |
| 0.0355649999999789 | 0.207 |
| 0.0365099999999789 | 0.207 |
| 0.0374549999999789 | 0.208 |
| 0.0383999999999789 | 0.208 |
| 0.0393449999999789 | 0.208 |
| 0.0402899999999789 | 0.208 |
| 0.0412349999999789 | 0.208 |
| 0.0421799999999789 | 0.209 |
| 0.0431249999999789 | 0.209 |
| 0.0440699999999789 | 0.209 |
| 0.0450149999999789 | 0.209 |
| 0.0459599999999789 | 0.209 |
| 0.0469049999999789 | 0.209 |
| 0.0478499999999789 | 0.21 |
| 0.0487949999999789 | 0.21 |
| 0.0497399999999789 | 0.21 |
| 0.0506849999999789 | 0.21 |
| 0.0516299999999789 | 0.21 |
| 0.0525749999999789 | 0.211 |
| 0.0535199999999789 | 0.211 |
| 0.0544649999999789 | 0.211 |
| 0.0554099999999789 | 0.211 |
| 0.0563549999999789 | 0.211 |
| 0.0572999999999789 | 0.212 |
| 0.0582449999999789 | 0.212 |
| 0.0591899999999789 | 0.212 |
| 0.0601349999999789 | 0.212 |
| 0.0610799999999789 | 0.212 |
| 0.0620249999999789 | 0.213 |
| 0.0629699999999789 | 0.213 |
| 0.0639149999999789 | 0.213 |
| 0.0648599999999789 | 0.213 |
| 0.0658049999999789 | 0.213 |
| 0.0667499999999789 | 0.214 |
| 0.0676949999999789 | 0.214 |
| 0.0686399999999789 | 0.214 |
| 0.0695849999999789 | 0.214 |
| 0.0705299999999789 | 0.214 |
| 0.0714749999999789 | 0.215 |
| 0.0724199999999789 | 0.215 |
| 0.0733649999999789 | 0.215 |
| 0.0743099999999789 | 0.215 |
| 0.0752549999999789 | 0.215 |
| 0.0761999999999789 | 0.216 |
| 0.0771449999999789 | 0.216 |
| 0.0780899999999789 | 0.216 |
| 0.0790349999999789 | 0.216 |
| 0.0799799999999789 | 0.217 |
| 0.0809249999999789 | 0.217 |
| 0.0818699999999789 | 0.217 |
| 0.0828149999999789 | 0.217 |
| 0.0837599999999789 | 0.217 |
| 0.0847049999999789 | 0.218 |
| 0.0856499999999789 | 0.218 |
| 0.0865949999999789 | 0.218 |
| 0.087539999999979 | 0.218 |
| 0.088484999999979 | 0.218 |
| 0.089429999999979 | 0.219 |
| 0.0903749999999789 | 0.219 |
| 0.0913199999999789 | 0.219 |
| 0.0922649999999789 | 0.219 |
| 0.093209999999979 | 0.219 |
| 0.094154999999979 | 0.22 |
| 0.095099999999979 | 0.22 |
| 0.096044999999979 | 0.22 |
| 0.096989999999979 | 0.22 |
| 0.097934999999979 | 0.221 |
| 0.098879999999979 | 0.221 |
| 0.099824999999979 | 0.221 |
| 0.100769999999979 | 0.221 |
| 0.101714999999979 | 0.221 |
| 0.102659999999979 | 0.222 |
| 0.103604999999979 | 0.222 |
| 0.104549999999979 | 0.222 |
| 0.105494999999979 | 0.222 |
| 0.106439999999979 | 0.222 |
| 0.107384999999979 | 0.223 |
| 0.108329999999979 | 0.223 |
| 0.109274999999979 | 0.223 |
| 0.110219999999979 | 0.223 |
| 0.111164999999979 | 0.224 |
| 0.112109999999979 | 0.224 |
| 0.113054999999979 | 0.224 |
| 0.113999999999979 | 0.224 |
| 0.114944999999979 | 0.225 |
| 0.115889999999979 | 0.225 |
| 0.116834999999979 | 0.225 |
| 0.117779999999979 | 0.225 |
| 0.118724999999979 | 0.225 |
| 0.119669999999979 | 0.226 |
| 0.120614999999979 | 0.226 |
| 0.121559999999979 | 0.226 |
| 0.122504999999979 | 0.226 |
| 0.123449999999979 | 0.227 |
| 0.124394999999979 | 0.227 |
| 0.125339999999979 | 0.227 |
| 0.126284999999979 | 0.227 |
| 0.127229999999979 | 0.228 |
| 0.128174999999979 | 0.228 |
| 0.129119999999979 | 0.228 |
| 0.130064999999979 | 0.228 |
| 0.131009999999979 | 0.228 |
| 0.131954999999979 | 0.229 |
| 0.132899999999979 | 0.229 |
| 0.133844999999979 | 0.229 |
| 0.134789999999979 | 0.229 |
| 0.135734999999979 | 0.23 |
| 0.136679999999979 | 0.23 |
| 0.137624999999979 | 0.23 |
| 0.138569999999979 | 0.23 |
| 0.139514999999979 | 0.231 |
| 0.140459999999979 | 0.231 |
| 0.141404999999979 | 0.231 |
| 0.142349999999979 | 0.231 |
| 0.143294999999979 | 0.232 |
| 0.144239999999979 | 0.232 |
| 0.145184999999979 | 0.232 |
| 0.146129999999979 | 0.232 |
| 0.147074999999979 | 0.233 |
| 0.148019999999979 | 0.233 |
| 0.148964999999979 | 0.233 |
| 0.149909999999979 | 0.233 |
| 0.150854999999979 | 0.234 |
| 0.151799999999979 | 0.234 |
| 0.152744999999979 | 0.234 |
| 0.153689999999979 | 0.234 |
| 0.154634999999979 | 0.235 |
| 0.155579999999979 | 0.235 |
| 0.156524999999979 | 0.235 |
| 0.157469999999979 | 0.235 |
| 0.158414999999979 | 0.236 |
| 0.159359999999979 | 0.236 |
| 0.160304999999979 | 0.236 |
| 0.161249999999979 | 0.236 |
| 0.162194999999979 | 0.237 |
| 0.163139999999979 | 0.237 |
| 0.164084999999979 | 0.237 |
| 0.165029999999979 | 0.238 |
| 0.165974999999979 | 0.238 |
| 0.166919999999979 | 0.238 |
| 0.167864999999979 | 0.238 |
| 0.168809999999979 | 0.239 |
| 0.169754999999979 | 0.239 |
| 0.170699999999979 | 0.239 |
| 0.171644999999979 | 0.239 |
| 0.172589999999979 | 0.24 |
| 0.173534999999979 | 0.24 |
| 0.174479999999979 | 0.24 |
| 0.175424999999979 | 0.24 |
| 0.176369999999979 | 0.241 |
| 0.177314999999979 | 0.241 |
| 0.178259999999979 | 0.241 |
| 0.179204999999979 | 0.242 |
| 0.180149999999979 | 0.242 |
| 0.181094999999979 | 0.242 |
| 0.182039999999979 | 0.242 |
| 0.182984999999979 | 0.243 |
| 0.183929999999979 | 0.243 |
| 0.184874999999979 | 0.243 |
| 0.185819999999979 | 0.244 |
| 0.186764999999979 | 0.244 |
| 0.187709999999979 | 0.244 |
| 0.188654999999979 | 0.244 |
| 0.189599999999979 | 0.245 |
| 0.190544999999979 | 0.245 |
| 0.191489999999979 | 0.245 |
| 0.192434999999979 | 0.246 |
| 0.193379999999979 | 0.246 |
| 0.194324999999979 | 0.246 |
| 0.195269999999979 | 0.246 |
| 0.196214999999979 | 0.247 |
| 0.197159999999979 | 0.247 |
| 0.198104999999979 | 0.247 |
| 0.199049999999979 | 0.248 |
| 0.199994999999979 | 0.248 |
| 0.200939999999979 | 0.248 |
| 0.201884999999979 | 0.249 |
| 0.202829999999979 | 0.249 |
| 0.203774999999979 | 0.249 |
| 0.204719999999979 | 0.25 |
| 0.205664999999979 | 0.25 |
| 0.206609999999979 | 0.25 |
| 0.207554999999979 | 0.25 |
| 0.208499999999979 | 0.251 |
| 0.209444999999979 | 0.251 |
| 0.210389999999979 | 0.251 |
| 0.211334999999979 | 0.252 |
| 0.212279999999979 | 0.252 |
| 0.213224999999979 | 0.252 |
| 0.214169999999979 | 0.253 |
| 0.215114999999979 | 0.253 |
| 0.216059999999979 | 0.253 |
| 0.217004999999979 | 0.254 |
| 0.217949999999979 | 0.254 |
| 0.218894999999979 | 0.254 |
| 0.219839999999979 | 0.255 |
| 0.220784999999979 | 0.255 |
| 0.221729999999979 | 0.255 |
| 0.222674999999979 | 0.256 |
| 0.223619999999979 | 0.256 |
| 0.224564999999979 | 0.256 |
| 0.225509999999979 | 0.257 |
| 0.226454999999979 | 0.257 |
| 0.227399999999979 | 0.257 |
| 0.228344999999979 | 0.258 |
| 0.229289999999979 | 0.258 |
| 0.230234999999979 | 0.258 |
| 0.231179999999979 | 0.259 |
| 0.232124999999979 | 0.259 |
| 0.233069999999979 | 0.259 |
| 0.234014999999979 | 0.26 |
| 0.234959999999979 | 0.26 |
| 0.235904999999979 | 0.26 |
| 0.236849999999979 | 0.261 |
| 0.237794999999979 | 0.261 |
| 0.238739999999979 | 0.261 |
| 0.239684999999979 | 0.262 |
| 0.240629999999979 | 0.262 |
| 0.241574999999979 | 0.262 |
| 0.242519999999979 | 0.263 |
| 0.243464999999979 | 0.263 |
| 0.244409999999979 | 0.263 |
| 0.245354999999979 | 0.264 |
| 0.246299999999979 | 0.264 |
| 0.247244999999979 | 0.265 |
| 0.248189999999979 | 0.265 |
| 0.249134999999979 | 0.265 |
| 0.250079999999979 | 0.266 |
| 0.251024999999979 | 0.266 |
| 0.251969999999979 | 0.266 |
| 0.252914999999979 | 0.267 |
| 0.253859999999979 | 0.267 |
| 0.254804999999979 | 0.268 |
| 0.255749999999979 | 0.268 |
| 0.256694999999979 | 0.268 |
| 0.257639999999979 | 0.269 |
| 0.258584999999979 | 0.269 |
| 0.259529999999979 | 0.269 |
| 0.260474999999979 | 0.27 |
| 0.261419999999979 | 0.27 |
| 0.262364999999979 | 0.271 |
| 0.263309999999979 | 0.271 |
| 0.264254999999979 | 0.271 |
| 0.265199999999979 | 0.272 |
| 0.266144999999979 | 0.272 |
| 0.267089999999979 | 0.272 |
| 0.268034999999979 | 0.273 |
| 0.268979999999979 | 0.273 |
| 0.269924999999979 | 0.274 |
| 0.270869999999979 | 0.274 |
| 0.271814999999979 | 0.274 |
| 0.272759999999979 | 0.275 |
| 0.273704999999979 | 0.275 |
| 0.274649999999979 | 0.276 |
| 0.275594999999978 | 0.276 |
| 0.276539999999978 | 0.276 |
| 0.277484999999978 | 0.277 |
| 0.278429999999978 | 0.277 |
| 0.279374999999978 | 0.278 |
| 0.280319999999978 | 0.278 |
| 0.281264999999978 | 0.279 |
| 0.282209999999978 | 0.279 |
| 0.283154999999978 | 0.279 |
| 0.284099999999978 | 0.28 |
| 0.285044999999978 | 0.28 |
| 0.285989999999978 | 0.281 |
| 0.286934999999978 | 0.281 |
| 0.287879999999978 | 0.281 |
| 0.288824999999978 | 0.282 |
| 0.289769999999978 | 0.282 |
| 0.290714999999978 | 0.283 |
| 0.291659999999978 | 0.283 |
| 0.292604999999978 | 0.284 |
| 0.293549999999978 | 0.284 |
| 0.294494999999978 | 0.284 |
| 0.295439999999978 | 0.285 |
| 0.296384999999978 | 0.285 |
| 0.297329999999978 | 0.286 |
| 0.298274999999978 | 0.286 |
| 0.299219999999978 | 0.287 |
| 0.300164999999978 | 0.287 |
| 0.301109999999978 | 0.288 |
| 0.302054999999978 | 0.288 |
| 0.302999999999978 | 0.288 |
| 0.303944999999978 | 0.289 |
| 0.304889999999978 | 0.289 |
| 0.305834999999978 | 0.29 |
| 0.306779999999978 | 0.29 |
| 0.307724999999978 | 0.291 |
| 0.308669999999978 | 0.291 |
| 0.309614999999977 | 0.292 |
| 0.310559999999977 | 0.292 |
| 0.311504999999977 | 0.293 |
| 0.312449999999977 | 0.293 |
| 0.313394999999977 | 0.293 |
| 0.314339999999977 | 0.294 |
| 0.315284999999977 | 0.294 |
| 0.316229999999977 | 0.295 |
| 0.317174999999977 | 0.295 |
| 0.318119999999977 | 0.296 |
| 0.319064999999977 | 0.296 |
| 0.320009999999977 | 0.297 |
| 0.320954999999977 | 0.297 |
| 0.321899999999977 | 0.298 |
| 0.322844999999977 | 0.298 |
| 0.323789999999977 | 0.299 |
| 0.324734999999977 | 0.299 |
| 0.325679999999977 | 0.3 |
| 0.326624999999977 | 0.3 |
| 0.327569999999977 | 0.301 |
| 0.328514999999977 | 0.301 |
| 0.329459999999977 | 0.302 |
| 0.330404999999977 | 0.302 |
| 0.331349999999977 | 0.303 |
| 0.332294999999977 | 0.303 |
| 0.333239999999977 | 0.304 |
| 0.334184999999977 | 0.304 |
| 0.335129999999977 | 0.305 |
| 0.336074999999977 | 0.305 |
| 0.337019999999977 | 0.306 |
| 0.337964999999977 | 0.306 |
| 0.338909999999977 | 0.307 |
| 0.339854999999977 | 0.307 |
| 0.340799999999977 | 0.308 |
| 0.341744999999977 | 0.308 |
| 0.342689999999977 | 0.309 |
| 0.343634999999977 | 0.309 |
| 0.344579999999977 | 0.31 |
| 0.345524999999976 | 0.31 |
| 0.346469999999976 | 0.311 |
| 0.347414999999976 | 0.311 |
| 0.348359999999976 | 0.312 |
| 0.349304999999976 | 0.312 |
| 0.350249999999976 | 0.313 |
| 0.351194999999976 | 0.314 |
| 0.352139999999976 | 0.314 |
| 0.353084999999976 | 0.315 |
| 0.354029999999976 | 0.315 |
| 0.354974999999976 | 0.316 |
| 0.355919999999976 | 0.316 |
| 0.356864999999976 | 0.317 |
| 0.357809999999976 | 0.317 |
| 0.358754999999976 | 0.318 |
| 0.359699999999976 | 0.318 |
| 0.360644999999976 | 0.319 |
| 0.361589999999976 | 0.32 |
| 0.362534999999976 | 0.32 |
| 0.363479999999976 | 0.321 |
| 0.364424999999976 | 0.321 |
| 0.365369999999976 | 0.322 |
| 0.366314999999976 | 0.322 |
| 0.367259999999976 | 0.323 |
| 0.368204999999976 | 0.324 |
| 0.369149999999976 | 0.324 |
| 0.370094999999976 | 0.325 |
| 0.371039999999976 | 0.325 |
| 0.371984999999976 | 0.326 |
| 0.372929999999976 | 0.326 |
| 0.373874999999976 | 0.327 |
| 0.374819999999976 | 0.328 |
| 0.375764999999976 | 0.328 |
| 0.376709999999976 | 0.329 |
| 0.377654999999976 | 0.329 |
| 0.378599999999976 | 0.33 |
| 0.379544999999976 | 0.331 |
| 0.380489999999976 | 0.331 |
| 0.381434999999975 | 0.332 |
| 0.382379999999975 | 0.332 |
| 0.383324999999975 | 0.333 |
| 0.384269999999975 | 0.334 |
| 0.385214999999975 | 0.334 |
| 0.386159999999975 | 0.335 |
| 0.387104999999975 | 0.335 |
| 0.388049999999975 | 0.336 |
| 0.388994999999975 | 0.337 |
| 0.389939999999975 | 0.337 |
| 0.390884999999975 | 0.338 |
| 0.391829999999975 | 0.339 |
| 0.392774999999975 | 0.339 |
| 0.393719999999975 | 0.34 |
| 0.394664999999975 | 0.34 |
| 0.395609999999975 | 0.341 |
| 0.396554999999975 | 0.342 |
| 0.397499999999975 | 0.342 |
| 0.398444999999975 | 0.343 |
| 0.399389999999975 | 0.344 |
| 0.400334999999975 | 0.344 |
| 0.401279999999975 | 0.345 |
| 0.402224999999975 | 0.346 |
| 0.403169999999975 | 0.346 |
| 0.404114999999975 | 0.347 |
| 0.405059999999975 | 0.347 |
| 0.406004999999975 | 0.348 |
| 0.406949999999975 | 0.349 |
| 0.407894999999975 | 0.349 |
| 0.408839999999975 | 0.35 |
| 0.409784999999975 | 0.351 |
| 0.410729999999975 | 0.351 |
| 0.411674999999975 | 0.352 |
| 0.412619999999975 | 0.353 |
| 0.413564999999975 | 0.353 |
| 0.414509999999975 | 0.354 |
| 0.415454999999975 | 0.355 |
| 0.416399999999975 | 0.355 |
| 0.417344999999975 | 0.356 |
| 0.418289999999974 | 0.357 |
| 0.419234999999974 | 0.358 |
| 0.420179999999974 | 0.358 |
| 0.421124999999974 | 0.359 |
| 0.422069999999974 | 0.36 |
| 0.423014999999974 | 0.36 |
| 0.423959999999974 | 0.361 |
| 0.424904999999974 | 0.362 |
| 0.425849999999974 | 0.362 |
| 0.426794999999974 | 0.363 |
| 0.427739999999974 | 0.364 |
| 0.428684999999974 | 0.365 |
| 0.429629999999974 | 0.365 |
| 0.430574999999974 | 0.366 |
| 0.431519999999974 | 0.367 |
| 0.432464999999974 | 0.367 |
| 0.433409999999974 | 0.368 |
| 0.434354999999974 | 0.369 |
| 0.435299999999974 | 0.37 |
| 0.436244999999974 | 0.37 |
| 0.437189999999974 | 0.371 |
| 0.438134999999974 | 0.372 |
| 0.439079999999974 | 0.372 |
| 0.440024999999974 | 0.373 |
| 0.440969999999974 | 0.374 |
| 0.441914999999974 | 0.375 |
| 0.442859999999974 | 0.375 |
| 0.443804999999974 | 0.376 |
| 0.444749999999974 | 0.377 |
| 0.445694999999974 | 0.378 |
| 0.446639999999974 | 0.378 |
| 0.447584999999974 | 0.379 |
| 0.448529999999974 | 0.38 |
| 0.449474999999974 | 0.381 |
| 0.450419999999974 | 0.381 |
| 0.451364999999974 | 0.382 |
| 0.452309999999974 | 0.383 |
| 0.453254999999974 | 0.384 |
| 0.454199999999973 | 0.385 |
| 0.455144999999973 | 0.385 |
| 0.456089999999973 | 0.386 |
| 0.457034999999973 | 0.387 |
| 0.457979999999973 | 0.388 |
| 0.458924999999973 | 0.388 |
| 0.459869999999973 | 0.389 |
| 0.460814999999973 | 0.39 |
| 0.461759999999973 | 0.391 |
| 0.462704999999973 | 0.392 |
| 0.463649999999973 | 0.392 |
| 0.464594999999973 | 0.393 |
| 0.465539999999973 | 0.394 |
| 0.466484999999973 | 0.395 |
| 0.467429999999973 | 0.396 |
| 0.468374999999973 | 0.396 |
| 0.469319999999973 | 0.397 |
| 0.470264999999973 | 0.398 |
| 0.471209999999973 | 0.399 |
| 0.472154999999973 | 0.4 |
| 0.473099999999973 | 0.401 |
| 0.474044999999973 | 0.401 |
| 0.474989999999973 | 0.402 |
| 0.475934999999973 | 0.403 |
| 0.476879999999973 | 0.404 |
| 0.477824999999973 | 0.405 |
| 0.478769999999973 | 0.405 |
| 0.479714999999973 | 0.406 |
| 0.480659999999973 | 0.407 |
| 0.481604999999973 | 0.408 |
| 0.482549999999973 | 0.409 |
| 0.483494999999973 | 0.41 |
| 0.484439999999973 | 0.411 |
| 0.485384999999973 | 0.411 |
| 0.486329999999973 | 0.412 |
| 0.487274999999973 | 0.413 |
| 0.488219999999973 | 0.414 |
| 0.489164999999972 | 0.415 |
| 0.490109999999972 | 0.416 |
| 0.491054999999972 | 0.417 |
| 0.491999999999972 | 0.417 |
| 0.492944999999972 | 0.418 |
| 0.493889999999972 | 0.419 |
| 0.494834999999972 | 0.42 |
| 0.495779999999972 | 0.421 |
| 0.496724999999972 | 0.422 |
| 0.497669999999972 | 0.423 |
| 0.498614999999972 | 0.424 |
| 0.499559999999972 | 0.425 |
| 0.500504999999972 | 0.425 |
| 0.501449999999972 | 0.426 |
| 0.502394999999972 | 0.427 |
| 0.503339999999972 | 0.428 |
| 0.504284999999972 | 0.429 |
| 0.505229999999972 | 0.43 |
| 0.506174999999972 | 0.431 |
| 0.507119999999972 | 0.432 |
| 0.508064999999972 | 0.433 |
| 0.509009999999972 | 0.434 |
| 0.509954999999972 | 0.435 |
| 0.510899999999972 | 0.436 |
| 0.511844999999972 | 0.436 |
| 0.512789999999972 | 0.437 |
| 0.513734999999972 | 0.438 |
| 0.514679999999972 | 0.439 |
| 0.515624999999972 | 0.44 |
| 0.516569999999972 | 0.441 |
| 0.517514999999972 | 0.442 |
| 0.518459999999972 | 0.443 |
| 0.519404999999972 | 0.444 |
| 0.520349999999972 | 0.445 |
| 0.521294999999972 | 0.446 |
| 0.522239999999972 | 0.447 |
| 0.523184999999972 | 0.448 |
| 0.524129999999972 | 0.449 |
| 0.525074999999972 | 0.45 |
| 0.526019999999972 | 0.451 |
| 0.526964999999971 | 0.452 |
| 0.527909999999971 | 0.453 |
| 0.528854999999971 | 0.454 |
| 0.529799999999971 | 0.455 |
| 0.530744999999971 | 0.456 |
| 0.531689999999971 | 0.457 |
| 0.532634999999971 | 0.458 |
| 0.533579999999971 | 0.459 |
| 0.534524999999971 | 0.46 |
| 0.535469999999971 | 0.461 |
| 0.536414999999971 | 0.462 |
| 0.537359999999971 | 0.463 |
| 0.538304999999971 | 0.464 |
| 0.539249999999971 | 0.465 |
| 0.540194999999971 | 0.466 |
| 0.541139999999971 | 0.467 |
| 0.542084999999971 | 0.468 |
| 0.543029999999971 | 0.469 |
| 0.543974999999971 | 0.47 |
| 0.544919999999971 | 0.471 |
| 0.545864999999971 | 0.472 |
| 0.546809999999971 | 0.473 |
| 0.547754999999971 | 0.474 |
| 0.548699999999971 | 0.475 |
| 0.549644999999971 | 0.476 |
| 0.550589999999971 | 0.477 |
| 0.551534999999971 | 0.478 |
| 0.552479999999971 | 0.479 |
| 0.553424999999971 | 0.48 |
| 0.554369999999971 | 0.481 |
| 0.555314999999971 | 0.482 |
| 0.556259999999971 | 0.483 |
| 0.557204999999971 | 0.484 |
| 0.558149999999971 | 0.486 |
| 0.559094999999971 | 0.487 |
| 0.560039999999971 | 0.488 |
| 0.560984999999971 | 0.489 |
| 0.56192999999997 | 0.49 |
| 0.56287499999997 | 0.491 |
| 0.56381999999997 | 0.492 |
| 0.56476499999997 | 0.493 |
| 0.56570999999997 | 0.494 |
| 0.56665499999997 | 0.495 |
| 0.56759999999997 | 0.496 |
| 0.56854499999997 | 0.497 |
| 0.56948999999997 | 0.499 |
| 0.57043499999997 | 0.5 |
| 0.57137999999997 | 0.501 |
| 0.57232499999997 | 0.502 |
| 0.57326999999997 | 0.503 |
| 0.57421499999997 | 0.504 |
| 0.57515999999997 | 0.505 |
| 0.57610499999997 | 0.506 |
| 0.57704999999997 | 0.508 |
| 0.57799499999997 | 0.509 |
| 0.57893999999997 | 0.51 |
| 0.57988499999997 | 0.511 |
| 0.58082999999997 | 0.512 |
| 0.58177499999997 | 0.513 |
| 0.58271999999997 | 0.514 |
| 0.58366499999997 | 0.516 |
| 0.58460999999997 | 0.517 |
| 0.58555499999997 | 0.518 |
| 0.58649999999997 | 0.519 |
| 0.58744499999997 | 0.52 |
| 0.58838999999997 | 0.521 |
| 0.58933499999997 | 0.523 |
| 0.59027999999997 | 0.524 |
| 0.59122499999997 | 0.525 |
| 0.59216999999997 | 0.526 |
| 0.59311499999997 | 0.527 |
| 0.59405999999997 | 0.528 |
| 0.59500499999997 | 0.53 |
| 0.59594999999997 | 0.531 |
| 0.59689499999997 | 0.532 |
| 0.597839999999969 | 0.533 |
| 0.598784999999969 | 0.534 |
| 0.599729999999969 | 0.536 |
| 0.600674999999969 | 0.537 |
| 0.601619999999969 | 0.538 |
| 0.602564999999969 | 0.539 |
| 0.603509999999969 | 0.541 |
| 0.604454999999969 | 0.542 |
| 0.605399999999969 | 0.543 |
| 0.606344999999969 | 0.544 |
| 0.607289999999969 | 0.545 |
| 0.608234999999969 | 0.547 |
| 0.609179999999969 | 0.548 |
| 0.610124999999969 | 0.549 |
| 0.611069999999969 | 0.55 |
| 0.612014999999969 | 0.552 |
| 0.612959999999969 | 0.553 |
| 0.613904999999969 | 0.554 |
| 0.614849999999969 | 0.555 |
| 0.615794999999969 | 0.557 |
| 0.616739999999969 | 0.558 |
| 0.617684999999969 | 0.559 |
| 0.618629999999969 | 0.56 |
| 0.619574999999969 | 0.562 |
| 0.620519999999969 | 0.563 |
| 0.621464999999969 | 0.564 |
| 0.622409999999969 | 0.566 |
| 0.623354999999969 | 0.567 |
| 0.624299999999969 | 0.568 |
| 0.625244999999969 | 0.569 |
| 0.626189999999969 | 0.571 |
| 0.627134999999969 | 0.572 |
| 0.628079999999969 | 0.573 |
| 0.629024999999969 | 0.575 |
| 0.629969999999969 | 0.576 |
| 0.630914999999968 | 0.577 |
| 0.631859999999968 | 0.579 |
| 0.632804999999968 | 0.58 |
| 0.633749999999968 | 0.581 |
| 0.634694999999968 | 0.583 |
| 0.635639999999968 | 0.584 |
| 0.636584999999968 | 0.585 |
| 0.637529999999968 | 0.587 |
| 0.638474999999968 | 0.588 |
| 0.639419999999968 | 0.589 |
| 0.640364999999968 | 0.591 |
| 0.641309999999968 | 0.592 |
| 0.642254999999968 | 0.593 |
| 0.643199999999968 | 0.595 |
| 0.644144999999968 | 0.596 |
| 0.645089999999968 | 0.597 |
| 0.646034999999968 | 0.599 |
| 0.646979999999968 | 0.6 |
| 0.647924999999968 | 0.602 |
| 0.648869999999968 | 0.603 |
| 0.649814999999968 | 0.604 |
| 0.650759999999968 | 0.606 |
| 0.651704999999968 | 0.607 |
| 0.652649999999968 | 0.609 |
| 0.653594999999968 | 0.61 |
| 0.654539999999968 | 0.611 |
| 0.655484999999968 | 0.613 |
| 0.656429999999968 | 0.614 |
| 0.657374999999968 | 0.616 |
| 0.658319999999968 | 0.617 |
| 0.659264999999968 | 0.618 |
| 0.660209999999968 | 0.62 |
| 0.661154999999968 | 0.621 |
| 0.662099999999968 | 0.623 |
| 0.663044999999968 | 0.624 |
| 0.663989999999968 | 0.626 |
| 0.664934999999968 | 0.627 |
| 0.665879999999968 | 0.628 |
| 0.666824999999967 | 0.63 |
| 0.667769999999967 | 0.631 |
| 0.668714999999967 | 0.633 |
| 0.669659999999967 | 0.634 |
| 0.670604999999967 | 0.636 |
| 0.671549999999967 | 0.637 |
| 0.672494999999967 | 0.639 |
| 0.673439999999967 | 0.64 |
| 0.674384999999967 | 0.642 |
| 0.675329999999967 | 0.643 |
| 0.676274999999967 | 0.645 |
| 0.677219999999967 | 0.646 |
| 0.678164999999967 | 0.648 |
| 0.679109999999967 | 0.649 |
| 0.680054999999967 | 0.651 |
| 0.680999999999967 | 0.652 |
| 0.681944999999967 | 0.654 |
| 0.682889999999967 | 0.655 |
| 0.683834999999967 | 0.657 |
| 0.684779999999967 | 0.658 |
| 0.685724999999967 | 0.66 |
| 0.686669999999967 | 0.661 |
| 0.687614999999967 | 0.663 |
| 0.688559999999967 | 0.664 |
| 0.689504999999967 | 0.666 |
| 0.690449999999967 | 0.667 |
| 0.691394999999967 | 0.669 |
| 0.692339999999967 | 0.67 |
| 0.693284999999967 | 0.672 |
| 0.694229999999967 | 0.673 |
| 0.695174999999967 | 0.675 |
| 0.696119999999967 | 0.677 |
| 0.697064999999967 | 0.678 |
| 0.698009999999967 | 0.68 |
| 0.698954999999967 | 0.681 |
| 0.699899999999967 | 0.683 |
| 0.700844999999967 | 0.684 |
| 0.701789999999967 | 0.686 |
| 0.702734999999967 | 0.688 |
| 0.703679999999966 | 0.689 |
| 0.704624999999966 | 0.691 |
| 0.705569999999966 | 0.692 |
| 0.706514999999966 | 0.694 |
| 0.707459999999966 | 0.696 |
| 0.708404999999966 | 0.697 |
| 0.709349999999966 | 0.699 |
| 0.710294999999966 | 0.7 |
| 0.711239999999966 | 0.702 |
| 0.712184999999966 | 0.704 |
| 0.713129999999966 | 0.705 |
| 0.714074999999966 | 0.707 |
| 0.715019999999966 | 0.709 |
| 0.715964999999966 | 0.71 |
| 0.716909999999966 | 0.712 |
| 0.717854999999966 | 0.713 |
| 0.718799999999966 | 0.715 |
| 0.719744999999966 | 0.717 |
| 0.720689999999966 | 0.718 |
| 0.721634999999966 | 0.72 |
| 0.722579999999966 | 0.722 |
| 0.723524999999966 | 0.723 |
| 0.724469999999966 | 0.725 |
| 0.725414999999966 | 0.727 |
| 0.726359999999966 | 0.728 |
| 0.727304999999966 | 0.73 |
| 0.728249999999966 | 0.732 |
| 0.729194999999966 | 0.734 |
| 0.730139999999966 | 0.735 |
| 0.731084999999966 | 0.737 |
| 0.732029999999966 | 0.739 |
| 0.732974999999966 | 0.74 |
| 0.733919999999966 | 0.742 |
| 0.734864999999966 | 0.744 |
| 0.735809999999966 | 0.746 |
| 0.736754999999966 | 0.747 |
| 0.737699999999966 | 0.749 |
| 0.738644999999966 | 0.751 |
| 0.739589999999965 | 0.752 |
| 0.740534999999965 | 0.754 |
| 0.741479999999965 | 0.756 |
| 0.742424999999965 | 0.758 |
| 0.743369999999965 | 0.759 |
| 0.744314999999965 | 0.761 |
| 0.745259999999965 | 0.763 |
| 0.746204999999965 | 0.765 |
| 0.747149999999965 | 0.767 |
| 0.748094999999965 | 0.768 |
| 0.749039999999965 | 0.77 |
| 0.749984999999965 | 0.772 |
| 0.750929999999965 | 0.774 |
| 0.751874999999965 | 0.775 |
| 0.752819999999965 | 0.777 |
| 0.753764999999965 | 0.779 |
| 0.754709999999965 | 0.781 |
| 0.755654999999965 | 0.783 |
| 0.756599999999965 | 0.784 |
| 0.757544999999965 | 0.786 |
| 0.758489999999965 | 0.788 |
| 0.759434999999965 | 0.79 |
| 0.760379999999965 | 0.792 |
| 0.761324999999965 | 0.794 |
| 0.762269999999965 | 0.795 |
| 0.763214999999965 | 0.797 |
| 0.764159999999965 | 0.799 |
| 0.765104999999965 | 0.801 |
| 0.766049999999965 | 0.803 |
| 0.766994999999965 | 0.805 |
| 0.767939999999965 | 0.806 |
| 0.768884999999965 | 0.808 |
| 0.769829999999965 | 0.81 |
| 0.770774999999965 | 0.812 |
| 0.771719999999965 | 0.814 |
| 0.772664999999965 | 0.816 |
| 0.773609999999965 | 0.818 |
| 0.774554999999965 | 0.82 |
| 0.775499999999964 | 0.821 |
| 0.776444999999964 | 0.823 |
| 0.777389999999964 | 0.825 |
| 0.778334999999964 | 0.827 |
| 0.779279999999964 | 0.829 |
| 0.780224999999964 | 0.831 |
| 0.781169999999964 | 0.833 |
| 0.782114999999964 | 0.835 |
| 0.783059999999964 | 0.837 |
| 0.784004999999964 | 0.839 |
| 0.784949999999964 | 0.841 |
| 0.785894999999964 | 0.843 |
| 0.786839999999964 | 0.845 |
| 0.787784999999964 | 0.846 |
| 0.788729999999964 | 0.848 |
| 0.789674999999964 | 0.85 |
| 0.790619999999964 | 0.852 |
| 0.791564999999964 | 0.854 |
| 0.792509999999964 | 0.856 |
| 0.793454999999964 | 0.858 |
| 0.794399999999964 | 0.86 |
| 0.795344999999964 | 0.862 |
| 0.796289999999964 | 0.864 |
| 0.797234999999964 | 0.866 |
| 0.798179999999964 | 0.868 |
| 0.799124999999964 | 0.87 |
| 0.800069999999964 | 0.872 |
| 0.801014999999964 | 0.874 |
| 0.801959999999964 | 0.876 |
| 0.802904999999964 | 0.878 |
| 0.803849999999964 | 0.88 |
| 0.804794999999964 | 0.882 |
| 0.805739999999964 | 0.884 |
| 0.806684999999964 | 0.886 |
| 0.807629999999964 | 0.888 |
| 0.808574999999964 | 0.89 |
| 0.809519999999964 | 0.892 |
| 0.810464999999964 | 0.894 |
| 0.811409999999964 | 0.897 |
| 0.812354999999963 | 0.899 |
| 0.813299999999963 | 0.901 |
| 0.814244999999963 | 0.903 |
| 0.815189999999963 | 0.905 |
| 0.816134999999963 | 0.907 |
| 0.817079999999963 | 0.909 |
| 0.818024999999963 | 0.911 |
| 0.818969999999963 | 0.913 |
| 0.819914999999963 | 0.915 |
| 0.820859999999963 | 0.917 |
| 0.821804999999963 | 0.919 |
| 0.822749999999963 | 0.921 |
| 0.823694999999963 | 0.924 |
| 0.824639999999963 | 0.926 |
| 0.825584999999963 | 0.928 |
| 0.826529999999963 | 0.93 |
| 0.827474999999963 | 0.932 |
| 0.828419999999963 | 0.934 |
| 0.829364999999963 | 0.936 |
| 0.830309999999963 | 0.938 |
| 0.831254999999963 | 0.941 |
| 0.832199999999963 | 0.943 |
| 0.833144999999963 | 0.945 |
| 0.834089999999963 | 0.947 |
| 0.835034999999963 | 0.949 |
| 0.835979999999963 | 0.951 |
| 0.836924999999963 | 0.954 |
| 0.837869999999963 | 0.956 |
| 0.838814999999963 | 0.958 |
| 0.839759999999963 | 0.96 |
| 0.840704999999963 | 0.962 |
| 0.841649999999963 | 0.965 |
| 0.842594999999963 | 0.967 |
| 0.843539999999963 | 0.969 |
| 0.844484999999963 | 0.971 |
| 0.845429999999963 | 0.973 |
| 0.846374999999963 | 0.976 |
| 0.847319999999962 | 0.978 |
| 0.848264999999962 | 0.98 |
| 0.849209999999962 | 0.982 |
| 0.850154999999962 | 0.984 |
| 0.851099999999962 | 0.987 |
| 0.852044999999962 | 0.989 |
| 0.852989999999962 | 0.991 |
| 0.853934999999962 | 0.993 |
| 0.854879999999962 | 0.996 |
| 0.855824999999962 | 0.998 |
| 0.856769999999962 | 1 |
| 0.857714999999962 | 1.003 |
| 0.858659999999962 | 1.005 |
| 0.859604999999962 | 1.007 |
| 0.860549999999962 | 1.009 |
| 0.861494999999962 | 1.012 |
| 0.862439999999962 | 1.014 |
| 0.863384999999962 | 1.016 |
| 0.864329999999962 | 1.019 |
| 0.865274999999962 | 1.021 |
| 0.866219999999962 | 1.023 |
| 0.867164999999962 | 1.026 |
| 0.868109999999962 | 1.028 |
| 0.869054999999962 | 1.03 |
| 0.869999999999962 | 1.033 |